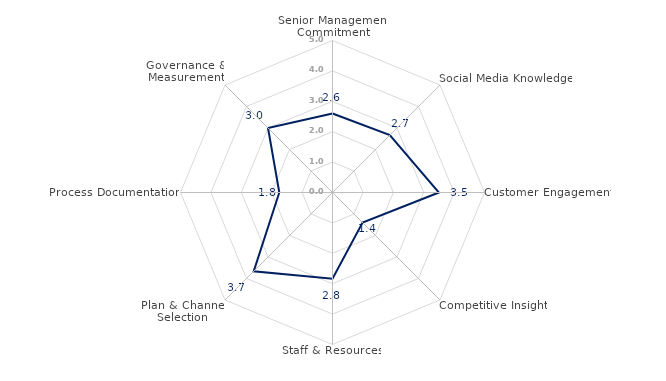
| Category | Maturity Index | Senior Management Commitment Social Media Knowledge Customer Engagement Competitive Insight Staff & Resources Plan & Channel Selection Process Documentation Governance & Measurement | 3,1 3,2 4,0 1,9 3,3 4,2 2,3 3,5 |
|---|---|---|---|
| Senior Management Commitment | 2.6 |  |  |
| Social Media Knowledge | 2.667 |  |  |
| Customer Engagement | 3.5 |  |  |
| Competitive Insight | 1.4 |  |  |
| Staff & Resources | 2.833 |  |  |
| Plan & Channel Selection | 3.667 |  |  |
| Process Documentation | 1.75 |  |  |
| Governance & Measurement | 3 |  |  |